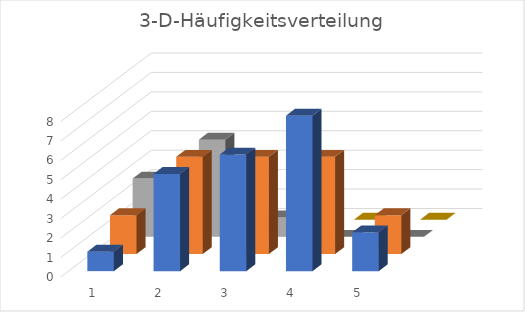
| Category | Series 0 | Series 1 | Series 2 | Series 3 |
|---|---|---|---|---|
| 0 | 1 | 2 | 3 | 0 |
| 1 | 5 | 5 | 5 | 2 |
| 2 | 6 | 5 | 1 | 0 |
| 3 | 8 | 5 | 0 | 0 |
| 4 | 2 | 2 | 0 | 0 |